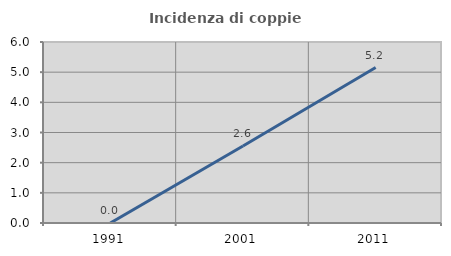
| Category | Incidenza di coppie miste |
|---|---|
| 1991.0 | 0 |
| 2001.0 | 2.551 |
| 2011.0 | 5.155 |